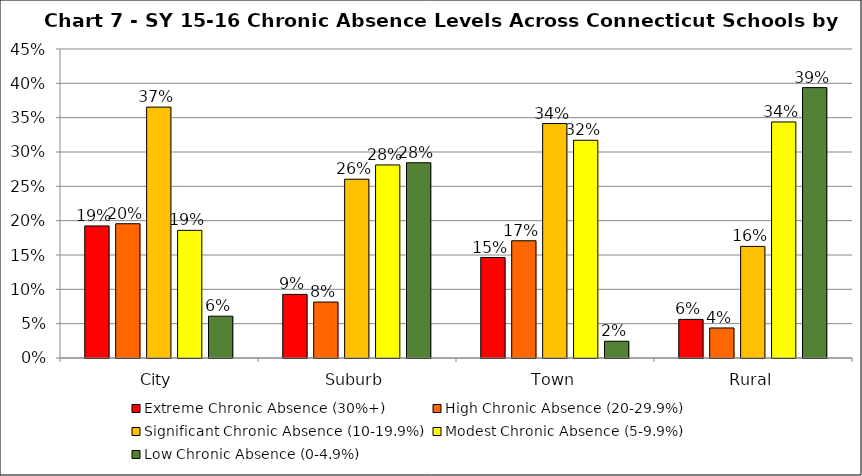
| Category | Extreme Chronic Absence (30%+) | High Chronic Absence (20-29.9%) | Significant Chronic Absence (10-19.9%) | Modest Chronic Absence (5-9.9%) | Low Chronic Absence (0-4.9%) |
|---|---|---|---|---|---|
| 0 | 0.192 | 0.196 | 0.365 | 0.186 | 0.061 |
| 1 | 0.093 | 0.081 | 0.26 | 0.281 | 0.284 |
| 2 | 0.146 | 0.171 | 0.341 | 0.317 | 0.024 |
| 3 | 0.056 | 0.044 | 0.162 | 0.344 | 0.394 |